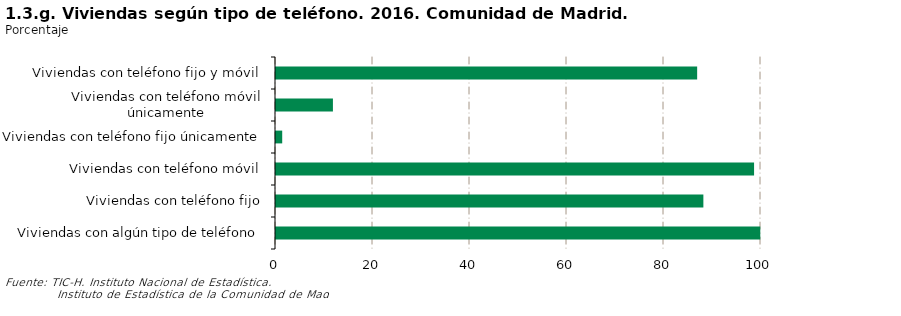
| Category | Series 0 |
|---|---|
| Viviendas con algún tipo de teléfono | 99.854 |
| Viviendas con teléfono fijo | 88.118 |
| Viviendas con teléfono móvil | 98.573 |
| Viviendas con teléfono fijo únicamente | 1.281 |
| Viviendas con teléfono móvil únicamente | 11.736 |
| Viviendas con teléfono fijo y móvil | 86.837 |